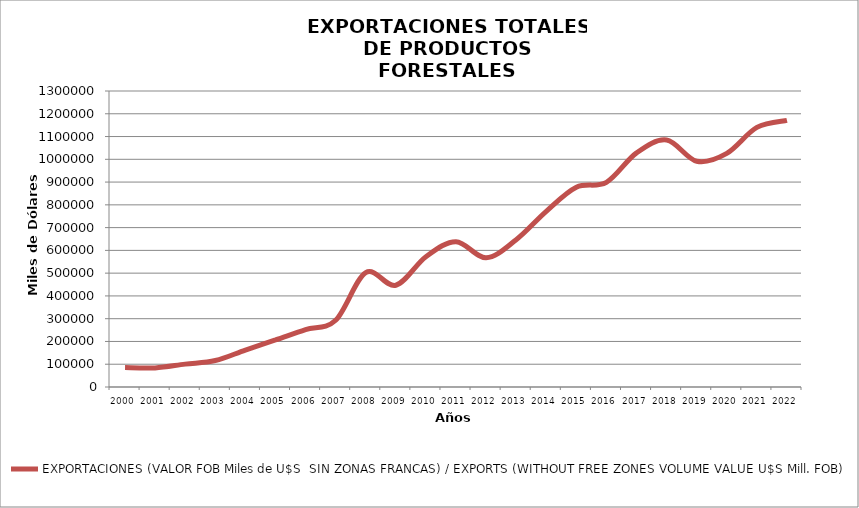
| Category | EXPORTACIONES (VALOR FOB Miles de U$S  SIN ZONAS FRANCAS) / EXPORTS (WITHOUT FREE ZONES VOLUME VALUE U$S Mill. FOB) |
|---|---|
| 2000.0 | 85189 |
| 2001.0 | 83915 |
| 2002.0 | 100530 |
| 2003.0 | 116276 |
| 2004.0 | 162381 |
| 2005.0 | 206800 |
| 2006.0 | 252344 |
| 2007.0 | 293023 |
| 2008.0 | 502390 |
| 2009.0 | 446887 |
| 2010.0 | 572032 |
| 2011.0 | 638068 |
| 2012.0 | 567836.475 |
| 2013.0 | 646890.896 |
| 2014.0 | 771420.467 |
| 2015.0 | 877126.549 |
| 2016.0 | 898962.309 |
| 2017.0 | 1028222.142 |
| 2018.0 | 1084780.89 |
| 2019.0 | 991636.55 |
| 2020.0 | 1026046.382 |
| 2021.0 | 1140075.158 |
| 2022.0 | 1170885.375 |